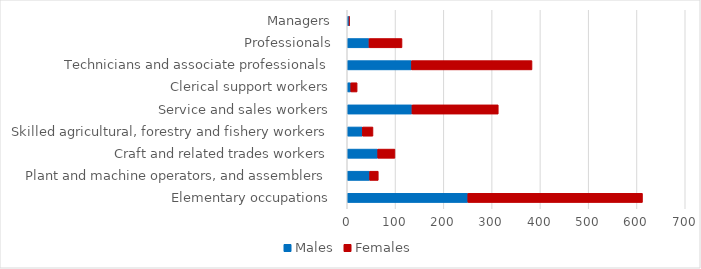
| Category | Males | Females |
|---|---|---|
| Elementary occupations | 249.801 | 361.705 |
| Plant and machine operators, and assemblers | 46.445 | 17.906 |
| Craft and related trades workers | 63.211 | 35.628 |
| Skilled agricultural, forestry and fishery workers | 31.482 | 21.869 |
| Service and sales workers | 134.142 | 178.707 |
| Clerical support workers | 7.484 | 13.041 |
| Technicians and associate professionals | 133.14 | 249.555 |
| Professionals | 45.155 | 68.328 |
| Managers | 3.918 | 0.803 |